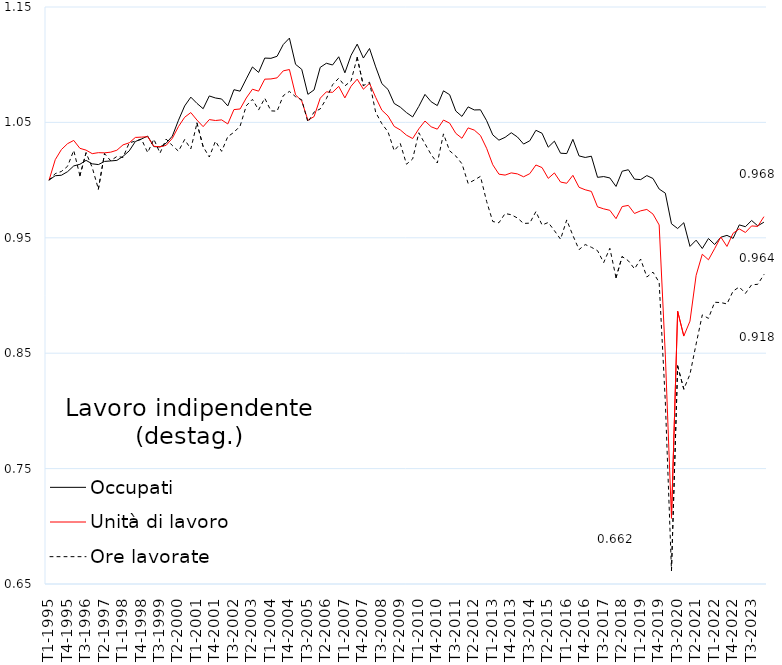
| Category | Occupati | Unità di lavoro | Ore lavorate |
|---|---|---|---|
| T1-1995 | 1 | 1 | 1 |
| T2-1995 | 1.004 | 1.018 | 1.006 |
| T3-1995 | 1.004 | 1.026 | 1.007 |
| T4-1995 | 1.007 | 1.032 | 1.012 |
| T1-1996 | 1.012 | 1.034 | 1.026 |
| T2-1996 | 1.014 | 1.028 | 1.004 |
| T3-1996 | 1.017 | 1.026 | 1.024 |
| T4-1996 | 1.014 | 1.023 | 1.011 |
| T1-1997 | 1.013 | 1.024 | 0.992 |
| T2-1997 | 1.016 | 1.024 | 1.023 |
| T3-1997 | 1.017 | 1.024 | 1.017 |
| T4-1997 | 1.017 | 1.026 | 1.02 |
| T1-1998 | 1.021 | 1.031 | 1.02 |
| T2-1998 | 1.025 | 1.032 | 1.032 |
| T3-1998 | 1.033 | 1.037 | 1.034 |
| T4-1998 | 1.036 | 1.037 | 1.035 |
| T1-1999 | 1.038 | 1.038 | 1.024 |
| T2-1999 | 1.029 | 1.029 | 1.035 |
| T3-1999 | 1.029 | 1.029 | 1.023 |
| T4-1999 | 1.032 | 1.03 | 1.036 |
| T1-2000 | 1.038 | 1.036 | 1.03 |
| T2-2000 | 1.052 | 1.046 | 1.025 |
| T3-2000 | 1.064 | 1.054 | 1.035 |
| T4-2000 | 1.072 | 1.059 | 1.027 |
| T1-2001 | 1.066 | 1.052 | 1.049 |
| T2-2001 | 1.062 | 1.046 | 1.029 |
| T3-2001 | 1.073 | 1.052 | 1.02 |
| T4-2001 | 1.071 | 1.052 | 1.034 |
| T1-2002 | 1.07 | 1.052 | 1.025 |
| T2-2002 | 1.064 | 1.049 | 1.038 |
| T3-2002 | 1.078 | 1.061 | 1.041 |
| T4-2002 | 1.077 | 1.062 | 1.047 |
| T1-2003 | 1.088 | 1.071 | 1.064 |
| T2-2003 | 1.098 | 1.079 | 1.07 |
| T3-2003 | 1.093 | 1.077 | 1.061 |
| T4-2003 | 1.106 | 1.087 | 1.071 |
| T1-2004 | 1.106 | 1.088 | 1.06 |
| T2-2004 | 1.107 | 1.089 | 1.06 |
| T3-2004 | 1.117 | 1.095 | 1.073 |
| T4-2004 | 1.123 | 1.096 | 1.077 |
| T1-2005 | 1.1 | 1.074 | 1.072 |
| T2-2005 | 1.096 | 1.069 | 1.07 |
| T3-2005 | 1.074 | 1.052 | 1.05 |
| T4-2005 | 1.078 | 1.055 | 1.059 |
| T1-2006 | 1.098 | 1.071 | 1.062 |
| T2-2006 | 1.101 | 1.076 | 1.071 |
| T3-2006 | 1.1 | 1.076 | 1.083 |
| T4-2006 | 1.107 | 1.081 | 1.088 |
| T1-2007 | 1.093 | 1.071 | 1.082 |
| T2-2007 | 1.108 | 1.081 | 1.086 |
| T3-2007 | 1.118 | 1.087 | 1.106 |
| T4-2007 | 1.106 | 1.079 | 1.082 |
| T1-2008 | 1.114 | 1.084 | 1.085 |
| T2-2008 | 1.098 | 1.072 | 1.059 |
| T3-2008 | 1.084 | 1.061 | 1.049 |
| T4-2008 | 1.079 | 1.056 | 1.042 |
| T1-2009 | 1.066 | 1.047 | 1.025 |
| T2-2009 | 1.063 | 1.043 | 1.032 |
| T3-2009 | 1.058 | 1.039 | 1.014 |
| T4-2009 | 1.055 | 1.036 | 1.018 |
| T1-2010 | 1.064 | 1.044 | 1.041 |
| T2-2010 | 1.074 | 1.051 | 1.031 |
| T3-2010 | 1.068 | 1.046 | 1.022 |
| T4-2010 | 1.065 | 1.044 | 1.015 |
| T1-2011 | 1.077 | 1.052 | 1.04 |
| T2-2011 | 1.074 | 1.049 | 1.025 |
| T3-2011 | 1.06 | 1.041 | 1.021 |
| T4-2011 | 1.055 | 1.036 | 1.014 |
| T1-2012 | 1.063 | 1.045 | 0.997 |
| T2-2012 | 1.061 | 1.043 | 1 |
| T3-2012 | 1.061 | 1.039 | 1.003 |
| T4-2012 | 1.052 | 1.028 | 0.982 |
| T1-2013 | 1.039 | 1.013 | 0.964 |
| T2-2013 | 1.035 | 1.005 | 0.963 |
| T3-2013 | 1.037 | 1.004 | 0.971 |
| T4-2013 | 1.041 | 1.006 | 0.97 |
| T1-2014 | 1.037 | 1.005 | 0.967 |
| T2-2014 | 1.031 | 1.003 | 0.962 |
| T3-2014 | 1.034 | 1.006 | 0.963 |
| T4-2014 | 1.043 | 1.013 | 0.973 |
| T1-2015 | 1.041 | 1.011 | 0.961 |
| T2-2015 | 1.029 | 1.002 | 0.963 |
| T3-2015 | 1.034 | 1.006 | 0.956 |
| T4-2015 | 1.023 | 0.998 | 0.949 |
| T1-2016 | 1.023 | 0.997 | 0.965 |
| T2-2016 | 1.035 | 1.004 | 0.952 |
| T3-2016 | 1.021 | 0.994 | 0.94 |
| T4-2016 | 1.02 | 0.992 | 0.944 |
| T1-2017 | 1.021 | 0.99 | 0.942 |
| T2-2017 | 1.002 | 0.977 | 0.939 |
| T3-2017 | 1.003 | 0.975 | 0.929 |
| T4-2017 | 1.002 | 0.974 | 0.941 |
| T1-2018 | 0.994 | 0.967 | 0.915 |
| T2-2018 | 1.008 | 0.977 | 0.934 |
| T3-2018 | 1.009 | 0.978 | 0.93 |
| T4-2018 | 1.001 | 0.971 | 0.923 |
| T1-2019 | 1 | 0.973 | 0.932 |
| T2-2019 | 1.004 | 0.975 | 0.916 |
| T3-2019 | 1.001 | 0.971 | 0.92 |
| T4-2019 | 0.992 | 0.961 | 0.911 |
| T1-2020 | 0.989 | 0.849 | 0.808 |
| T2-2020 | 0.962 | 0.707 | 0.662 |
| T3-2020 | 0.958 | 0.886 | 0.839 |
| T4-2020 | 0.963 | 0.865 | 0.819 |
| T1-2021 | 0.943 | 0.878 | 0.832 |
| T2-2021 | 0.948 | 0.918 | 0.858 |
| T3-2021 | 0.941 | 0.936 | 0.883 |
| T4-2021 | 0.949 | 0.931 | 0.88 |
| T1-2022 | 0.944 | 0.941 | 0.894 |
| T2-2022 | 0.95 | 0.951 | 0.894 |
| T3-2022 | 0.952 | 0.943 | 0.893 |
| T4-2022 | 0.95 | 0.954 | 0.904 |
| T1-2023 | 0.961 | 0.958 | 0.907 |
| T2-2023 | 0.96 | 0.955 | 0.902 |
| T3-2023 | 0.965 | 0.96 | 0.909 |
| T4-2023 | 0.96 | 0.96 | 0.91 |
| T1-2024 | 0.964 | 0.968 | 0.918 |